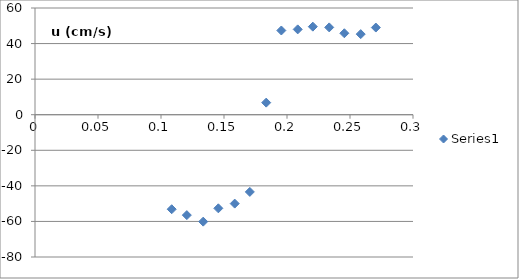
| Category | Series 0 |
|---|---|
| 0.1085 | -53.138 |
| 0.1205 | -56.456 |
| 0.1335 | -60.126 |
| 0.14550000000000002 | -52.63 |
| 0.1585 | -49.979 |
| 0.17049999999999998 | -43.403 |
| 0.1835 | 6.791 |
| 0.1955 | 47.353 |
| 0.20850000000000002 | 47.975 |
| 0.2205 | 49.51 |
| 0.23349999999999999 | 49.09 |
| 0.2455 | 45.798 |
| 0.2585 | 45.306 |
| 0.27049999999999996 | 49.005 |